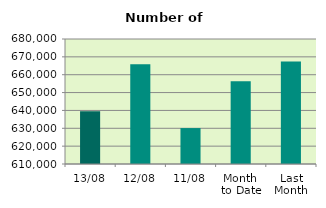
| Category | Series 0 |
|---|---|
| 13/08 | 639476 |
| 12/08 | 665870 |
| 11/08 | 630116 |
| Month 
to Date | 656308.4 |
| Last
Month | 667427.091 |